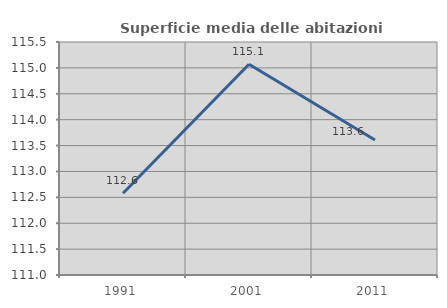
| Category | Superficie media delle abitazioni occupate |
|---|---|
| 1991.0 | 112.58 |
| 2001.0 | 115.071 |
| 2011.0 | 113.608 |